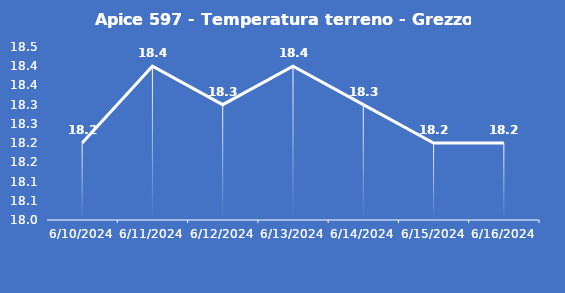
| Category | Apice 597 - Temperatura terreno - Grezzo (°C) |
|---|---|
| 6/10/24 | 18.2 |
| 6/11/24 | 18.4 |
| 6/12/24 | 18.3 |
| 6/13/24 | 18.4 |
| 6/14/24 | 18.3 |
| 6/15/24 | 18.2 |
| 6/16/24 | 18.2 |